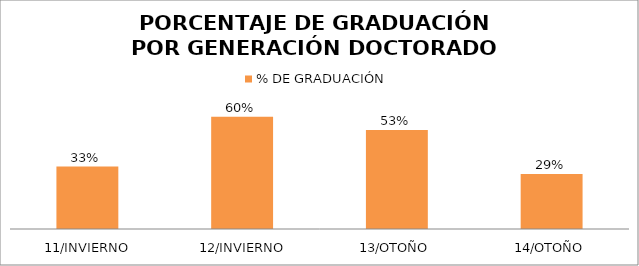
| Category | % DE GRADUACIÓN |
|---|---|
|  11/INVIERNO | 0.333 |
|  12/INVIERNO | 0.6 |
| 13/OTOÑO | 0.529 |
| 14/OTOÑO | 0.294 |